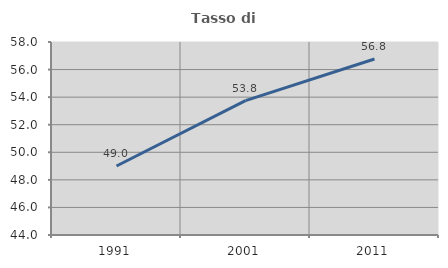
| Category | Tasso di occupazione   |
|---|---|
| 1991.0 | 49.005 |
| 2001.0 | 53.75 |
| 2011.0 | 56.764 |